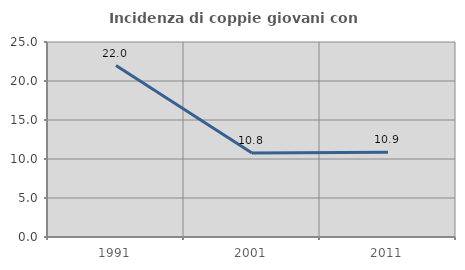
| Category | Incidenza di coppie giovani con figli |
|---|---|
| 1991.0 | 21.983 |
| 2001.0 | 10.783 |
| 2011.0 | 10.879 |